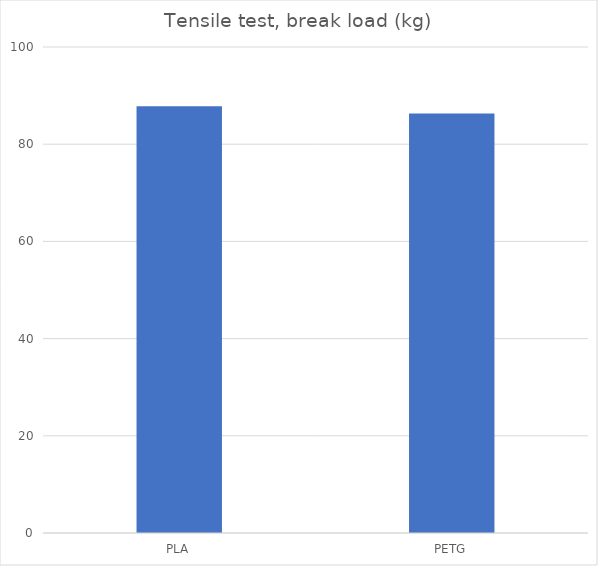
| Category | Average (kg) |
|---|---|
| PLA | 87.8 |
| PETG | 86.3 |